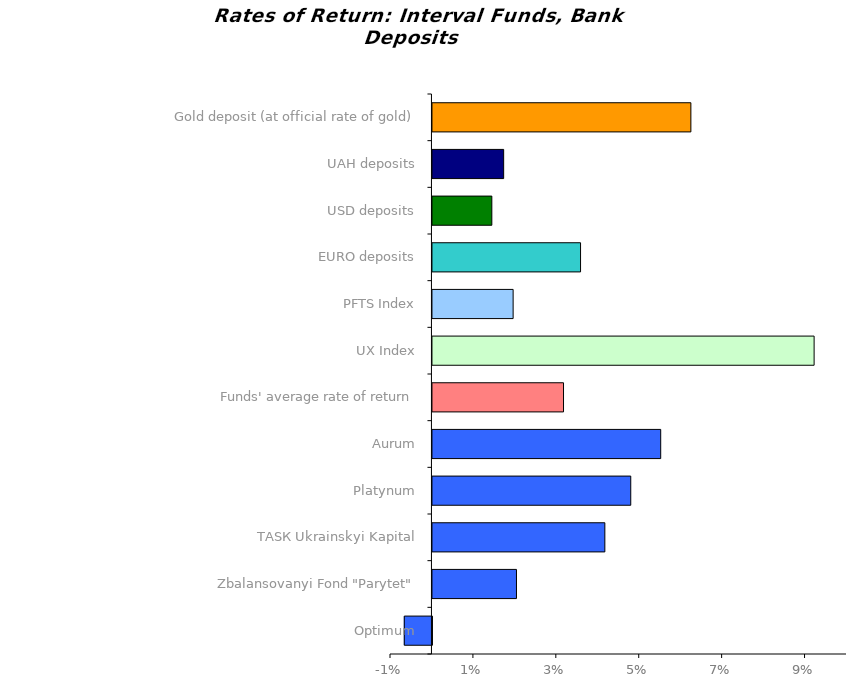
| Category | Series 0 |
|---|---|
| Optimum | -0.007 |
| Zbalansovanyi Fond "Parytet" | 0.02 |
| ТАSК Ukrainskyi Kapital | 0.042 |
| Platynum | 0.048 |
| Аurum | 0.055 |
| Funds' average rate of return | 0.032 |
| UX Index | 0.092 |
| PFTS Index | 0.019 |
| EURO deposits | 0.036 |
| USD deposits | 0.014 |
| UAH deposits | 0.017 |
| Gold deposit (at official rate of gold) | 0.062 |